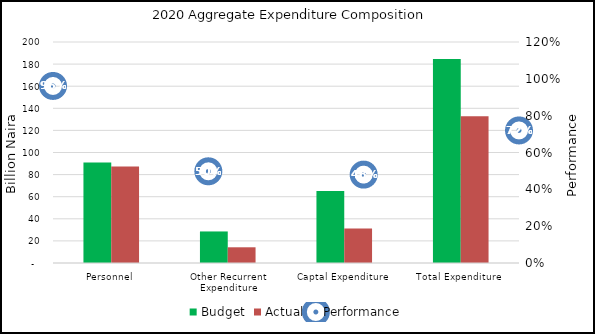
| Category | Budget | Actual |
|---|---|---|
| Personnel | 90936180949.46 | 87418856966.77 |
| Other Recurrent Expenditure | 28548918682 | 14214231532.99 |
| Captal Expenditure | 65182353610 | 31278902357.1 |
| Total Expenditure  | 184667453241.46 | 132911990856.86 |